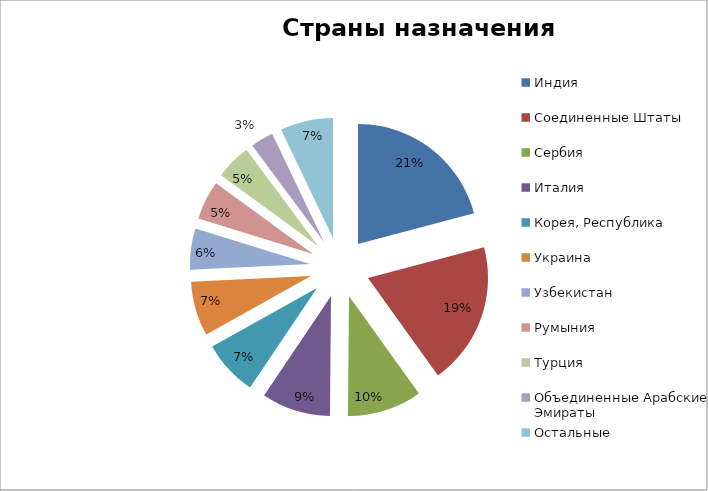
| Category | Стоимость, USD |
|---|---|
| Индия | 2075589.62 |
| Соединенные Штаты | 1908922.4 |
| Сербия | 998437.99 |
| Италия | 921476.6 |
| Корея, Республика | 742963.6 |
| Украина | 731592.03 |
| Узбекистан | 549135.58 |
| Румыния | 520822.4 |
| Турция | 476789.08 |
| Объединенные Арабские Эмираты | 304895.25 |
| Остальные | 707182.1 |